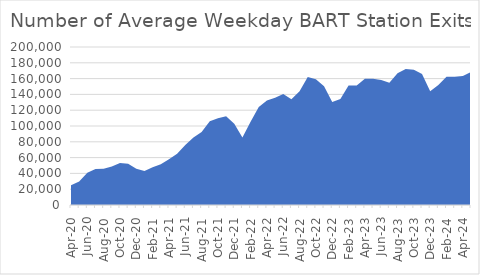
| Category | Number of BART Riders |
|---|---|
| 2020-04-01 | 25136 |
| 2020-05-01 | 29878 |
| 2020-06-01 | 40979 |
| 2020-07-01 | 45633 |
| 2020-08-01 | 46020 |
| 2020-09-01 | 48838 |
| 2020-10-01 | 53255 |
| 2020-11-01 | 52198 |
| 2020-12-01 | 45893 |
| 2021-01-01 | 43012 |
| 2021-02-01 | 47665 |
| 2021-03-01 | 51596 |
| 2021-04-01 | 57886 |
| 2021-05-01 | 64934 |
| 2021-06-01 | 75963 |
| 2021-07-01 | 85291 |
| 2021-08-01 | 92402 |
| 2021-09-01 | 105997 |
| 2021-10-01 | 109781 |
| 2021-11-01 | 112282 |
| 2021-12-01 | 102993 |
| 2022-01-01 | 85463 |
| 2022-02-01 | 105374 |
| 2022-03-01 | 124094 |
| 2022-04-01 | 132181 |
| 2022-05-01 | 135824 |
| 2022-06-01 | 140564 |
| 2022-07-01 | 133858 |
| 2022-08-01 | 144008 |
| 2022-09-01 | 161902 |
| 2022-10-01 | 159099 |
| 2022-11-01 | 150242 |
| 2022-12-01 | 130283 |
| 2023-01-01 | 134140 |
| 2023-02-01 | 151390 |
| 2023-03-01 | 151150 |
| 2023-04-01 | 159696 |
| 2023-05-01 | 159918 |
| 2023-06-01 | 158361 |
| 2023-07-01 | 154825 |
| 2023-08-01 | 166637 |
| 2023-09-01 | 172051 |
| 2023-10-01 | 171277 |
| 2023-11-01 | 165802 |
| 2023-12-01 | 144070 |
| 2024-01-01 | 151854 |
| 2024-02-01 | 162186 |
| 2024-03-01 | 162459 |
| 2024-04-01 | 163267 |
| 2024-05-01 | 168356 |